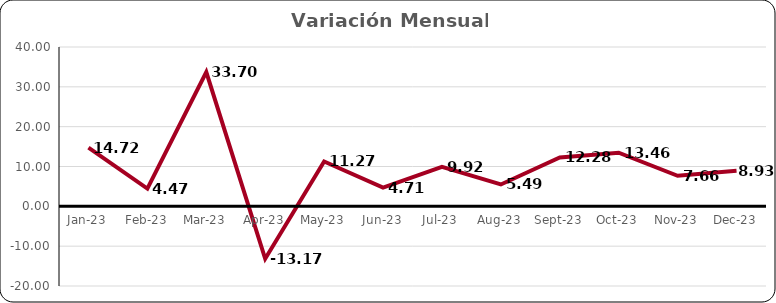
| Category | Variación
Mensual % |
|---|---|
| 2023-01-01 | 14.72 |
| 2023-02-01 | 4.47 |
| 2023-03-01 | 33.703 |
| 2023-04-01 | -13.17 |
| 2023-05-01 | 11.266 |
| 2023-06-01 | 4.709 |
| 2023-07-01 | 9.92 |
| 2023-08-01 | 5.491 |
| 2023-09-01 | 12.279 |
| 2023-10-01 | 13.456 |
| 2023-11-01 | 7.665 |
| 2023-12-01 | 8.928 |